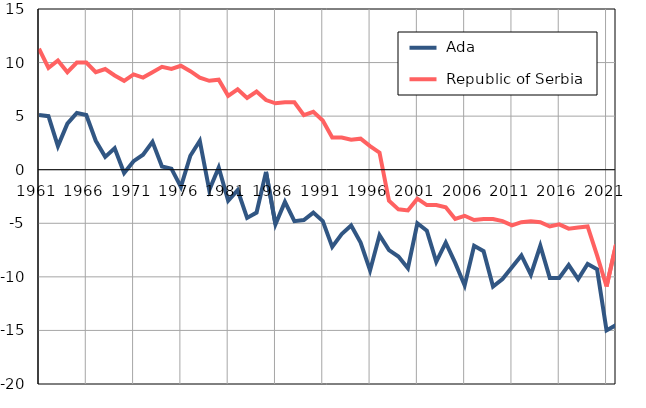
| Category |  Ada |  Republic of Serbia |
|---|---|---|
| 1961.0 | 5.1 | 11.3 |
| 1962.0 | 5 | 9.5 |
| 1963.0 | 2.2 | 10.2 |
| 1964.0 | 4.3 | 9.1 |
| 1965.0 | 5.3 | 10 |
| 1966.0 | 5.1 | 10 |
| 1967.0 | 2.7 | 9.1 |
| 1968.0 | 1.2 | 9.4 |
| 1969.0 | 2 | 8.8 |
| 1970.0 | -0.3 | 8.3 |
| 1971.0 | 0.8 | 8.9 |
| 1972.0 | 1.4 | 8.6 |
| 1973.0 | 2.6 | 9.1 |
| 1974.0 | 0.3 | 9.6 |
| 1975.0 | 0.1 | 9.4 |
| 1976.0 | -1.6 | 9.7 |
| 1977.0 | 1.3 | 9.2 |
| 1978.0 | 2.7 | 8.6 |
| 1979.0 | -1.9 | 8.3 |
| 1980.0 | 0.2 | 8.4 |
| 1981.0 | -2.9 | 6.9 |
| 1982.0 | -1.9 | 7.5 |
| 1983.0 | -4.5 | 6.7 |
| 1984.0 | -4 | 7.3 |
| 1985.0 | -0.2 | 6.5 |
| 1986.0 | -5.1 | 6.2 |
| 1987.0 | -3 | 6.3 |
| 1988.0 | -4.8 | 6.3 |
| 1989.0 | -4.7 | 5.1 |
| 1990.0 | -4 | 5.4 |
| 1991.0 | -4.8 | 4.6 |
| 1992.0 | -7.2 | 3 |
| 1993.0 | -6 | 3 |
| 1994.0 | -5.2 | 2.8 |
| 1995.0 | -6.8 | 2.9 |
| 1996.0 | -9.4 | 2.2 |
| 1997.0 | -6.1 | 1.6 |
| 1998.0 | -7.5 | -2.9 |
| 1999.0 | -8.1 | -3.7 |
| 2000.0 | -9.2 | -3.8 |
| 2001.0 | -5 | -2.7 |
| 2002.0 | -5.7 | -3.3 |
| 2003.0 | -8.6 | -3.3 |
| 2004.0 | -6.8 | -3.5 |
| 2005.0 | -8.7 | -4.6 |
| 2006.0 | -10.8 | -4.3 |
| 2007.0 | -7.1 | -4.7 |
| 2008.0 | -7.6 | -4.6 |
| 2009.0 | -10.9 | -4.6 |
| 2010.0 | -10.2 | -4.8 |
| 2011.0 | -9.1 | -5.2 |
| 2012.0 | -8 | -4.9 |
| 2013.0 | -9.8 | -4.8 |
| 2014.0 | -7.1 | -4.9 |
| 2015.0 | -10.1 | -5.3 |
| 2016.0 | -10.1 | -5.1 |
| 2017.0 | -8.9 | -5.5 |
| 2018.0 | -10.2 | -5.4 |
| 2019.0 | -8.8 | -5.3 |
| 2020.0 | -9.3 | -8 |
| 2021.0 | -15 | -10.9 |
| 2022.0 | -14.5 | -7 |